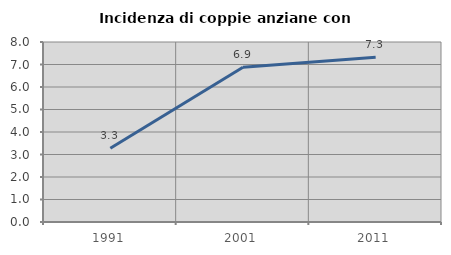
| Category | Incidenza di coppie anziane con figli |
|---|---|
| 1991.0 | 3.279 |
| 2001.0 | 6.881 |
| 2011.0 | 7.317 |